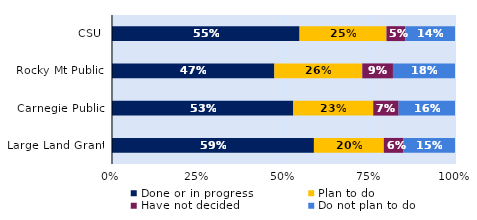
| Category | Done or in progress | Plan to do | Have not decided | Do not plan to do |
|---|---|---|---|---|
| CSU | 0.547 | 0.253 | 0.055 | 0.145 |
| Rocky Mt Public | 0.473 | 0.256 | 0.089 | 0.181 |
| Carnegie Public | 0.529 | 0.233 | 0.074 | 0.164 |
| Large Land Grant | 0.589 | 0.204 | 0.057 | 0.15 |